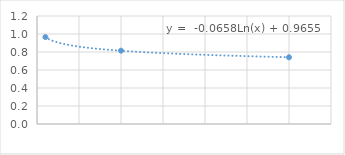
| Category | Series 0 |
|---|---|
| 1.0 | 0.965 |
| 10.0 | 0.815 |
| 30.0 | 0.741 |